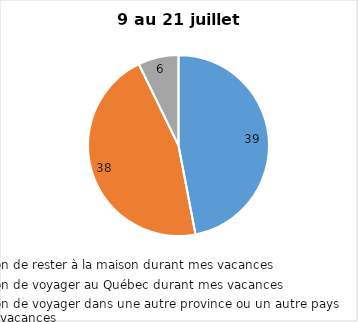
| Category | Series 0 |
|---|---|
| J’ai l’intention de rester à la maison durant mes vacances | 39 |
| J’ai l’intention de voyager au Québec durant mes vacances | 38 |
| J’ai l’intention de voyager dans une autre province ou un autre pays durant mes vacances | 6 |